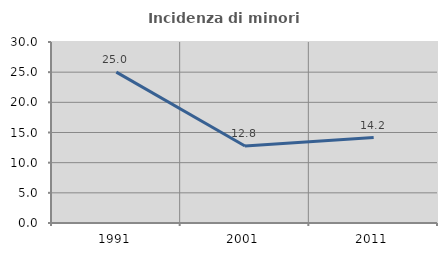
| Category | Incidenza di minori stranieri |
|---|---|
| 1991.0 | 25 |
| 2001.0 | 12.766 |
| 2011.0 | 14.159 |